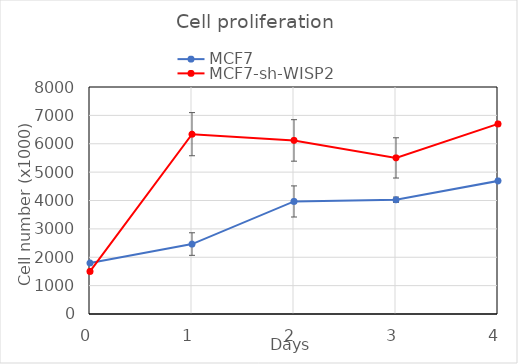
| Category | MCF7 | MCF7-sh-WISP2 |
|---|---|---|
| 0.0 | 1800 | 1500 |
| 1.0 | 2465 | 6337.5 |
| 2.0 | 3966.5 | 6117 |
| 3.0 | 4027 | 5501.5 |
| 4.0 | 4689 | 6697.5 |